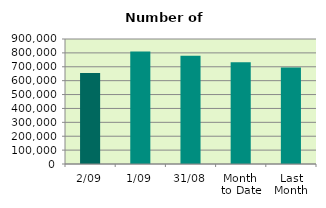
| Category | Series 0 |
|---|---|
| 2/09 | 655062 |
| 1/09 | 809784 |
| 31/08 | 778556 |
| Month 
to Date | 732423 |
| Last
Month | 695004.455 |